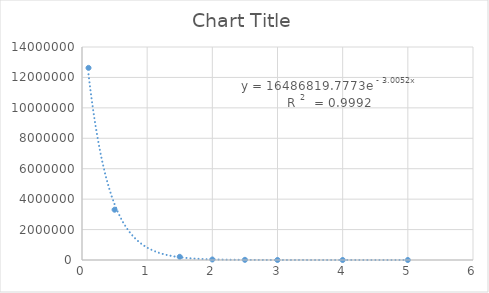
| Category | Series 0 |
|---|---|
| 0.1 | 12627554.543 |
| 0.5 | 3305713.789 |
| 1.5 | 209332.998 |
| 2.0 | 33164.96 |
| 2.5 | 10426.866 |
| 3.0 | 1886.675 |
| 4.0 | 115.924 |
| 5.0 | 4.378 |